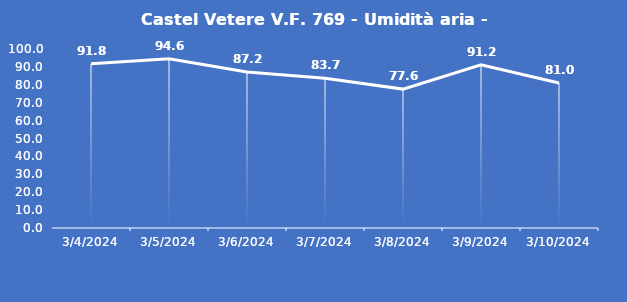
| Category | Castel Vetere V.F. 769 - Umidità aria - Grezzo (%) |
|---|---|
| 3/4/24 | 91.8 |
| 3/5/24 | 94.6 |
| 3/6/24 | 87.2 |
| 3/7/24 | 83.7 |
| 3/8/24 | 77.6 |
| 3/9/24 | 91.2 |
| 3/10/24 | 81 |